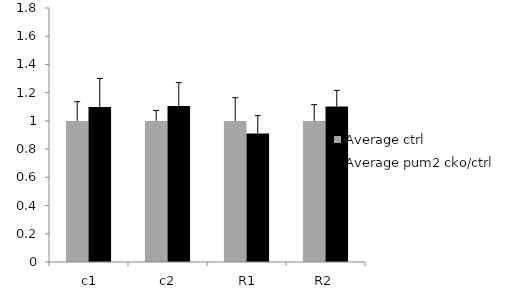
| Category | Average ctrl | Average pum2 cko/ctrl |
|---|---|---|
|  c1 | 1 | 1.099 |
|  c2 | 1 | 1.106 |
|  R1 | 1 | 0.911 |
| R2 | 1 | 1.103 |